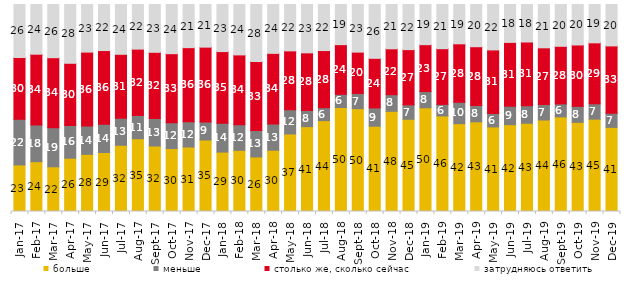
| Category | больше | меньше | столько же, сколько сейчас | затрудняюсь ответить |
|---|---|---|---|---|
| 2017-01-01 | 22.5 | 22.05 | 29.85 | 25.6 |
| 2017-02-01 | 24.05 | 17.7 | 34.2 | 24 |
| 2017-03-01 | 21.6 | 18.9 | 33.8 | 25.7 |
| 2017-04-01 | 25.75 | 15.8 | 30.05 | 28.4 |
| 2017-05-01 | 27.6 | 13.7 | 35.7 | 23 |
| 2017-06-01 | 28.5 | 13.65 | 35.6 | 22.25 |
| 2017-07-01 | 32 | 13 | 30.95 | 24.05 |
| 2017-08-01 | 35.15 | 11.2 | 32.1 | 21.55 |
| 2017-09-01 | 31.65 | 13.3 | 31.95 | 23.1 |
| 2017-10-01 | 30.4 | 12.45 | 33.35 | 23.75 |
| 2017-11-01 | 31.15 | 12.15 | 35.85 | 20.85 |
| 2017-12-01 | 34.55 | 8.7 | 36.15 | 20.6 |
| 2018-01-01 | 28.7 | 13.9 | 34.65 | 22.75 |
| 2018-02-01 | 29.55 | 12.4 | 33.7 | 24.35 |
| 2018-03-01 | 26.35 | 12.75 | 33.35 | 27.55 |
| 2018-04-01 | 29.6 | 12.7 | 34.1 | 23.6 |
| 2018-05-01 | 37.45 | 11.7 | 28.45 | 22.4 |
| 2018-06-01 | 41 | 7.8 | 27.85 | 23.35 |
| 2018-07-01 | 43.9 | 6.25 | 27.6 | 22.25 |
| 2018-08-01 | 50.25 | 6.35 | 24 | 19.4 |
| 2018-09-01 | 49.65 | 7.35 | 19.95 | 23 |
| 2018-10-01 | 41.2 | 8.85 | 23.95 | 26 |
| 2018-11-01 | 48.403 | 8.034 | 22.156 | 21.407 |
| 2018-12-01 | 44.55 | 6.95 | 26.7 | 21.8 |
| 2019-01-01 | 50.1 | 7.85 | 22.65 | 19.4 |
| 2019-02-01 | 46.15 | 5.6 | 26.9 | 21.35 |
| 2019-03-01 | 42.417 | 10.343 | 28.245 | 18.996 |
| 2019-04-01 | 43.317 | 7.871 | 28.416 | 20.396 |
| 2019-05-01 | 40.862 | 6.439 | 30.758 | 21.942 |
| 2019-06-01 | 41.945 | 8.878 | 30.873 | 18.304 |
| 2019-07-01 | 42.624 | 8.465 | 30.792 | 18.119 |
| 2019-08-01 | 44.206 | 7.493 | 27.373 | 20.929 |
| 2019-09-01 | 45.693 | 6.287 | 27.822 | 20.198 |
| 2019-10-01 | 43.069 | 7.723 | 29.653 | 19.554 |
| 2019-11-01 | 44.604 | 7.426 | 29.455 | 18.515 |
| 2019-12-01 | 40.644 | 6.782 | 32.574 | 20 |